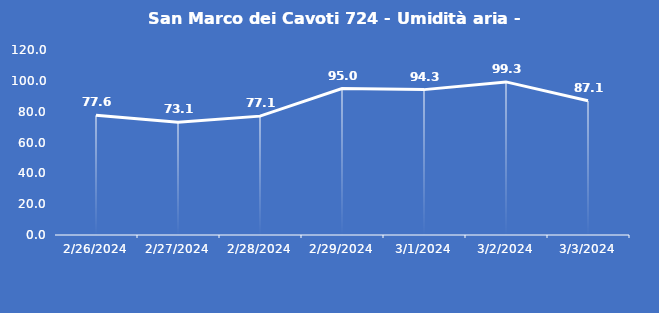
| Category | San Marco dei Cavoti 724 - Umidità aria - Grezzo (%) |
|---|---|
| 2/26/24 | 77.6 |
| 2/27/24 | 73.1 |
| 2/28/24 | 77.1 |
| 2/29/24 | 95 |
| 3/1/24 | 94.3 |
| 3/2/24 | 99.3 |
| 3/3/24 | 87.1 |